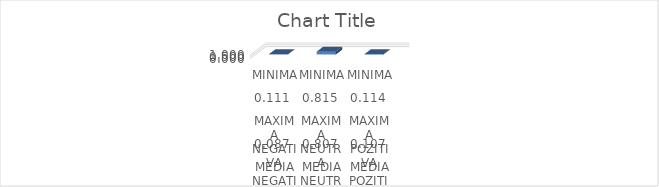
| Category | Series 0 |
|---|---|
| 0 | 0.076 |
| 1 | 0.785 |
| 2 | 0.095 |